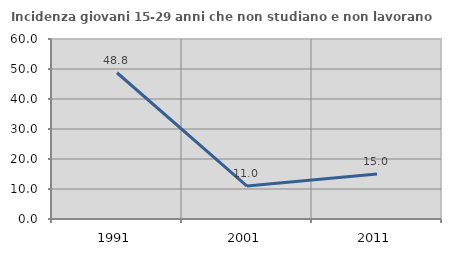
| Category | Incidenza giovani 15-29 anni che non studiano e non lavorano  |
|---|---|
| 1991.0 | 48.75 |
| 2001.0 | 10.989 |
| 2011.0 | 14.995 |